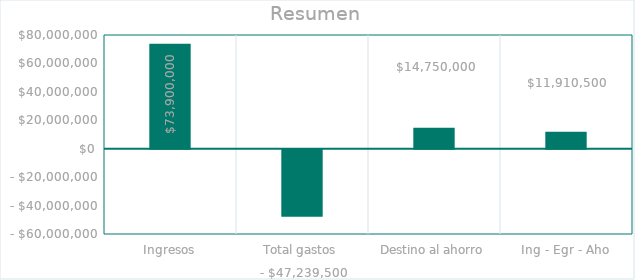
| Category | Series 0 |
|---|---|
| Ingresos | 73900000 |
| Total gastos | -47239500 |
| Destino al ahorro | 14750000 |
| Ing - Egr - Aho | 11910500 |